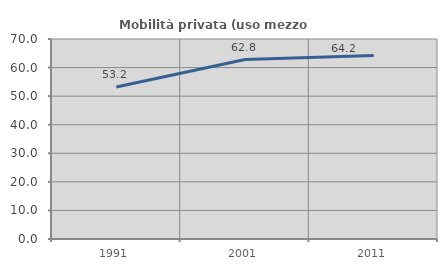
| Category | Mobilità privata (uso mezzo privato) |
|---|---|
| 1991.0 | 53.184 |
| 2001.0 | 62.823 |
| 2011.0 | 64.232 |